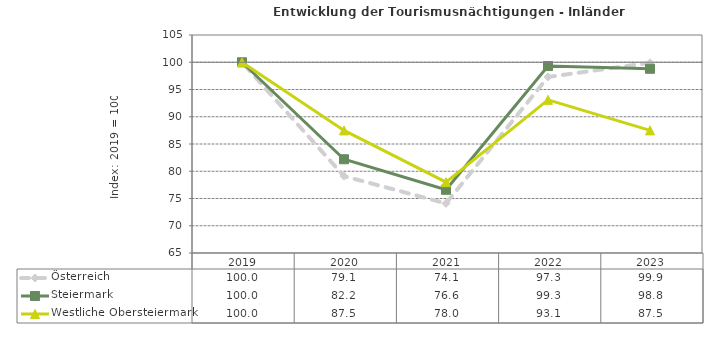
| Category | Österreich | Steiermark | Westliche Obersteiermark |
|---|---|---|---|
| 2023.0 | 99.9 | 98.8 | 87.5 |
| 2022.0 | 97.3 | 99.3 | 93.1 |
| 2021.0 | 74.1 | 76.6 | 78 |
| 2020.0 | 79.1 | 82.2 | 87.5 |
| 2019.0 | 100 | 100 | 100 |